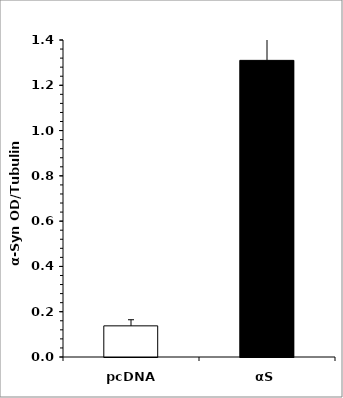
| Category | Series 0 |
|---|---|
| pcDNA | 0.138 |
| αS | 1.31 |